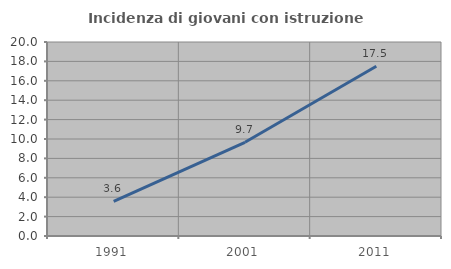
| Category | Incidenza di giovani con istruzione universitaria |
|---|---|
| 1991.0 | 3.571 |
| 2001.0 | 9.657 |
| 2011.0 | 17.5 |